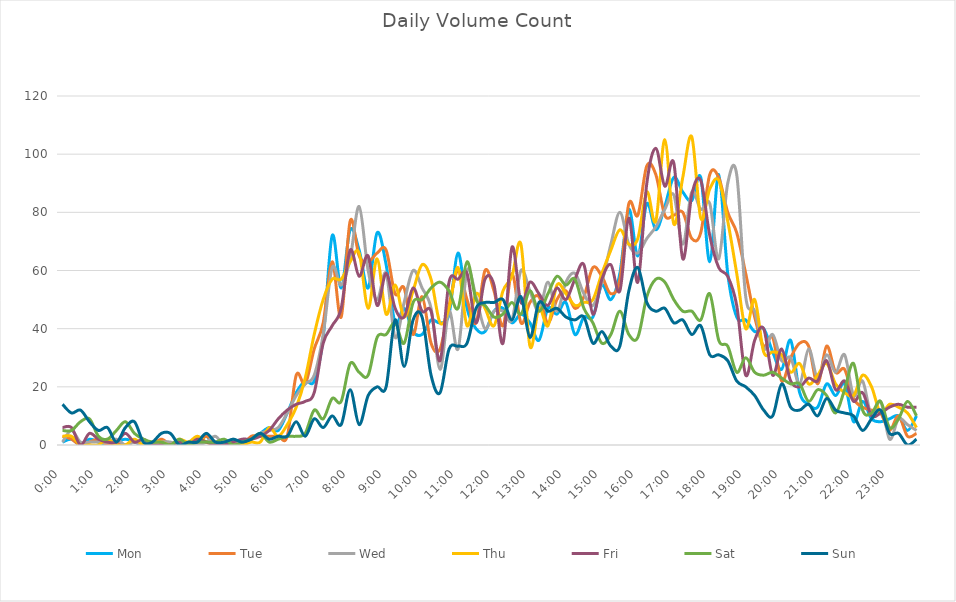
| Category | Mon | Tue | Wed | Thu | Fri | Sat | Sun |
|---|---|---|---|---|---|---|---|
| 0.0 | 1 | 3 | 1 | 3 | 6 | 5 | 14 |
| 0.010416666666666666 | 2 | 2 | 5 | 3 | 6 | 5 | 11 |
| 0.020833333333333332 | 0 | 0 | 1 | 0 | 0 | 8 | 12 |
| 0.03125 | 2 | 1 | 1 | 0 | 4 | 9 | 8 |
| 0.041666666666666664 | 1 | 2 | 1 | 0 | 2 | 3 | 5 |
| 0.05208333333333333 | 0 | 0 | 1 | 2 | 1 | 2 | 6 |
| 0.06249999999999999 | 1 | 1 | 2 | 0 | 1 | 5 | 1 |
| 0.07291666666666666 | 2 | 0 | 0 | 0 | 4 | 8 | 6 |
| 0.08333333333333333 | 1 | 1 | 1 | 2 | 1 | 4 | 8 |
| 0.09375 | 0 | 0 | 0 | 0 | 2 | 2 | 1 |
| 0.10416666666666667 | 0 | 0 | 0 | 1 | 0 | 1 | 1 |
| 0.11458333333333334 | 0 | 2 | 1 | 1 | 0 | 1 | 4 |
| 0.125 | 0 | 0 | 1 | 0 | 0 | 0 | 4 |
| 0.13541666666666666 | 0 | 0 | 0 | 2 | 1 | 2 | 0 |
| 0.14583333333333331 | 0 | 0 | 0 | 1 | 0 | 0 | 1 |
| 0.15624999999999997 | 2 | 0 | 0 | 3 | 2 | 1 | 1 |
| 0.16666666666666663 | 3 | 3 | 1 | 1 | 1 | 1 | 4 |
| 0.1770833333333333 | 0 | 0 | 3 | 0 | 0 | 1 | 1 |
| 0.18749999999999994 | 1 | 1 | 0 | 0 | 0 | 2 | 1 |
| 0.1979166666666666 | 0 | 0 | 2 | 0 | 1 | 0 | 2 |
| 0.20833333333333326 | 1 | 0 | 0 | 0 | 2 | 1 | 1 |
| 0.21874999999999992 | 2 | 3 | 2 | 1 | 2 | 2 | 2 |
| 0.22916666666666657 | 4 | 3 | 4 | 1 | 3 | 4 | 4 |
| 0.23958333333333323 | 6 | 3 | 5 | 6 | 5 | 1 | 2 |
| 0.2499999999999999 | 5 | 3 | 6 | 3 | 9 | 2 | 3 |
| 0.2604166666666666 | 11 | 3 | 11 | 7 | 12 | 3 | 3 |
| 0.27083333333333326 | 18 | 24 | 17 | 13 | 14 | 3 | 8 |
| 0.28124999999999994 | 22 | 21 | 21 | 23 | 15 | 4 | 3 |
| 0.29166666666666663 | 22 | 33 | 24 | 38 | 18 | 12 | 9 |
| 0.3020833333333333 | 37 | 42 | 38 | 50 | 35 | 9 | 6 |
| 0.3125 | 72 | 63 | 61 | 57 | 41 | 16 | 10 |
| 0.3229166666666667 | 54 | 44 | 55 | 57 | 47 | 15 | 7 |
| 0.33333333333333337 | 74 | 77 | 64 | 63 | 67 | 28 | 19 |
| 0.34375000000000006 | 67 | 65 | 82 | 66 | 58 | 25 | 7 |
| 0.35416666666666674 | 54 | 63 | 60 | 47 | 65 | 24 | 17 |
| 0.3645833333333334 | 73 | 66 | 50 | 64 | 48 | 37 | 20 |
| 0.3750000000000001 | 62 | 67 | 59 | 45 | 59 | 38 | 20 |
| 0.3854166666666668 | 42 | 52 | 37 | 55 | 47 | 42 | 43 |
| 0.3958333333333335 | 47 | 54 | 49 | 44 | 44 | 35 | 27 |
| 0.40625000000000017 | 39 | 38 | 60 | 53 | 54 | 49 | 43 |
| 0.41666666666666685 | 38 | 51 | 54 | 62 | 46 | 50 | 44 |
| 0.4270833333333333 | 43 | 35 | 47 | 57 | 46 | 54 | 24 |
| 0.4375000000000002 | 42 | 33 | 26 | 42 | 29 | 56 | 18 |
| 0.4479166666666669 | 45 | 48 | 46 | 47 | 56 | 53 | 33 |
| 0.4583333333333333 | 66 | 60 | 33 | 61 | 57 | 47 | 34 |
| 0.4687500000000003 | 47 | 50 | 60 | 41 | 59 | 63 | 35 |
| 0.47916666666666696 | 40 | 42 | 51 | 52 | 42 | 50 | 47 |
| 0.4895833333333333 | 39 | 60 | 40 | 47 | 57 | 48 | 49 |
| 0.5000000000000003 | 46 | 53 | 46 | 41 | 55 | 44 | 49 |
| 0.510416666666667 | 47 | 41 | 46 | 53 | 35 | 45 | 50 |
| 0.5208333333333334 | 42 | 59 | 43 | 58 | 68 | 49 | 43 |
| 0.5312500000000002 | 45 | 42 | 60 | 69 | 49 | 45 | 51 |
| 0.5416666666666669 | 42 | 49 | 53 | 34 | 56 | 53 | 37 |
| 0.5520833333333335 | 36 | 51 | 46 | 47 | 52 | 46 | 49 |
| 0.5625000000000001 | 47 | 42 | 56 | 41 | 48 | 52 | 46 |
| 0.5729166666666667 | 45 | 50 | 46 | 55 | 54 | 58 | 47 |
| 0.5833333333333334 | 49 | 53 | 56 | 52 | 50 | 55 | 44 |
| 0.59375 | 38 | 47 | 59 | 48 | 57 | 57 | 43 |
| 0.6041666666666666 | 44 | 51 | 52 | 49 | 62 | 47 | 44 |
| 0.6145833333333333 | 44 | 61 | 48 | 50 | 45 | 42 | 35 |
| 0.6249999999999999 | 55 | 58 | 56 | 59 | 57 | 35 | 39 |
| 0.6354166666666665 | 50 | 52 | 69 | 67 | 62 | 38 | 34 |
| 0.6458333333333331 | 59 | 57 | 80 | 74 | 53 | 46 | 34 |
| 0.6562499999999998 | 81 | 83 | 69 | 69 | 78 | 38 | 53 |
| 0.6666666666666666 | 65 | 79 | 66 | 71 | 56 | 37 | 61 |
| 0.677083333333333 | 83 | 96 | 71 | 87 | 90 | 51 | 49 |
| 0.6874999999999997 | 74 | 93 | 75 | 77 | 102 | 57 | 46 |
| 0.6979166666666666 | 82 | 79 | 81 | 105 | 89 | 56 | 47 |
| 0.7083333333333329 | 92 | 79 | 86 | 76 | 97 | 50 | 42 |
| 0.7187499999999996 | 87 | 80 | 69 | 92 | 64 | 46 | 43 |
| 0.7291666666666666 | 84 | 71 | 87 | 106 | 86 | 46 | 38 |
| 0.7395833333333328 | 92 | 73 | 81 | 78 | 91 | 43 | 41 |
| 0.75 | 63 | 93 | 83 | 88 | 72 | 52 | 31 |
| 0.7604166666666666 | 93 | 92 | 64 | 91 | 61 | 36 | 31 |
| 0.7708333333333327 | 59 | 80 | 90 | 77 | 58 | 34 | 29 |
| 0.78125 | 44 | 73 | 93 | 59 | 48 | 25 | 22 |
| 0.7916666666666666 | 43 | 59 | 51 | 40 | 24 | 30 | 20 |
| 0.8020833333333326 | 39 | 44 | 46 | 50 | 36 | 25 | 17 |
| 0.8125 | 40 | 34 | 33 | 32 | 40 | 24 | 12 |
| 0.8229166666666666 | 32 | 37 | 38 | 32 | 24 | 25 | 10 |
| 0.8333333333333334 | 26 | 22 | 29 | 31 | 33 | 23 | 21 |
| 0.84375 | 36 | 30 | 30 | 25 | 22 | 21 | 13 |
| 0.8541666666666666 | 18 | 35 | 21 | 28 | 20 | 21 | 12 |
| 0.8645833333333334 | 14 | 34 | 33 | 21 | 23 | 15 | 14 |
| 0.875 | 13 | 21 | 23 | 24 | 22 | 19 | 10 |
| 0.8854166666666666 | 21 | 34 | 31 | 28 | 29 | 17 | 16 |
| 0.8958333333333334 | 17 | 25 | 25 | 21 | 19 | 11 | 12 |
| 0.90625 | 21 | 26 | 31 | 18 | 22 | 19 | 11 |
| 0.9166666666666666 | 8 | 16 | 17 | 17 | 15 | 28 | 10 |
| 0.9270833333333334 | 15 | 13 | 22 | 24 | 18 | 12 | 5 |
| 0.9375 | 9 | 12 | 10 | 20 | 10 | 11 | 9 |
| 0.9479166666666666 | 8 | 11 | 15 | 11 | 11 | 15 | 12 |
| 0.9583333333333334 | 9 | 5 | 2 | 14 | 13 | 6 | 4 |
| 0.96875 | 10 | 10 | 9 | 13 | 14 | 9 | 4 |
| 0.9791666666666666 | 5 | 3 | 7 | 11 | 13 | 15 | 0 |
| 0.9895833333333334 | 10 | 4 | 5 | 6 | 13 | 10 | 2 |